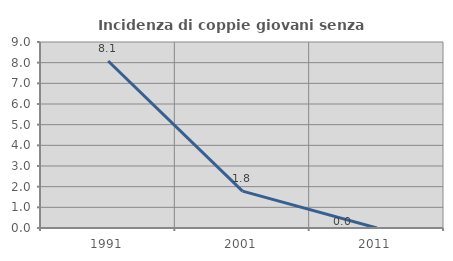
| Category | Incidenza di coppie giovani senza figli |
|---|---|
| 1991.0 | 8.081 |
| 2001.0 | 1.786 |
| 2011.0 | 0 |